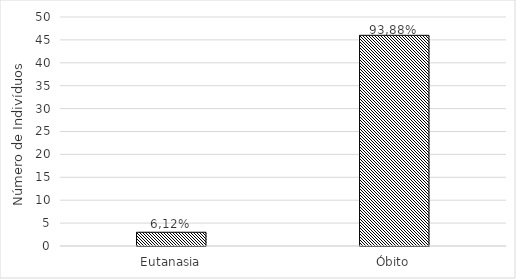
| Category | N° de indíviduos |
|---|---|
| Eutanasia | 3 |
| Óbito | 46 |